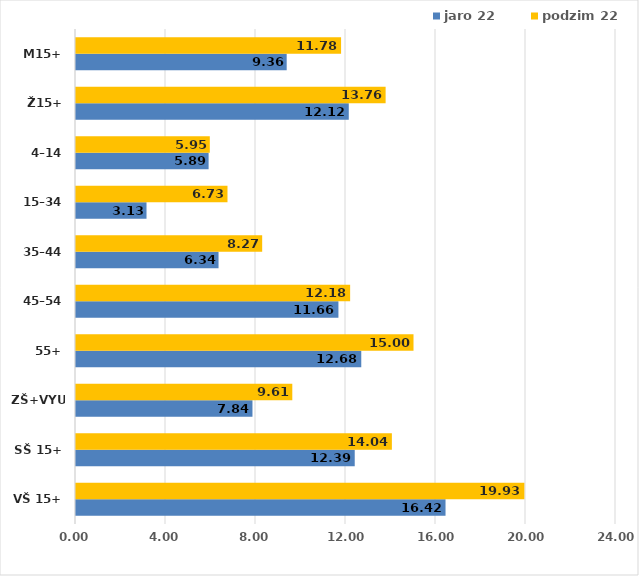
| Category | jaro 22 | podzim 22 |
|---|---|---|
| VŠ 15+ | 16.424 | 19.926 |
| SŠ 15+ | 12.388 | 14.039 |
| ZŠ+VYUČ | 7.843 | 9.613 |
| 55+ | 12.679 | 15 |
| 45–54 | 11.663 | 12.184 |
| 35–44 | 6.335 | 8.274 |
| 15–34 | 3.134 | 6.733 |
| 4–14 | 5.894 | 5.947 |
| Ž15+ | 12.123 | 13.761 |
| M15+ | 9.364 | 11.781 |